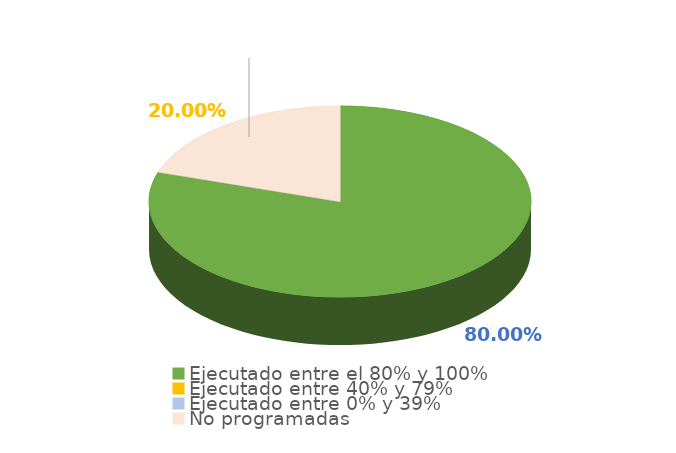
| Category | Series 0 |
|---|---|
| Ejecutado entre el 80% y 100% | 0.8 |
| Ejecutado entre 40% y 79% | 0 |
| Ejecutado entre 0% y 39% | 0 |
| No programadas | 0.2 |